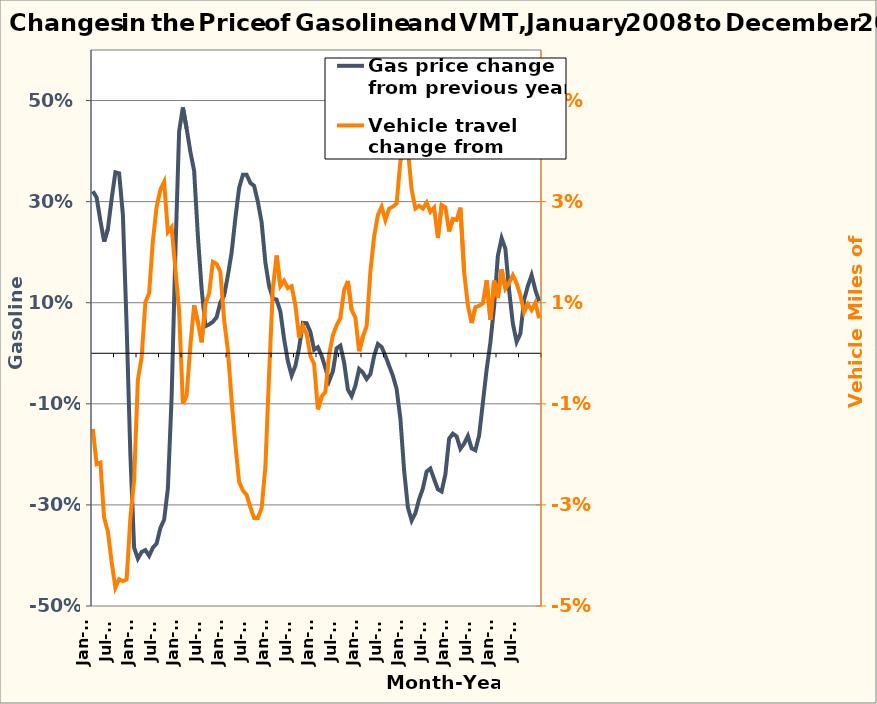
| Category | Gas price change from previous year |
|---|---|
| 2008-01-01 | 0.32 |
| 2008-02-01 | 0.308 |
| 2008-03-01 | 0.262 |
| 2008-04-01 | 0.221 |
| 2008-05-01 | 0.246 |
| 2008-06-01 | 0.305 |
| 2008-07-01 | 0.358 |
| 2008-08-01 | 0.356 |
| 2008-09-01 | 0.274 |
| 2008-10-01 | 0.054 |
| 2008-11-01 | -0.201 |
| 2008-12-01 | -0.384 |
| 2009-01-01 | -0.406 |
| 2009-02-01 | -0.393 |
| 2009-03-01 | -0.39 |
| 2009-04-01 | -0.401 |
| 2009-05-01 | -0.385 |
| 2009-06-01 | -0.376 |
| 2009-07-01 | -0.346 |
| 2009-08-01 | -0.329 |
| 2009-09-01 | -0.268 |
| 2009-10-01 | -0.087 |
| 2009-11-01 | 0.199 |
| 2009-12-01 | 0.439 |
| 2010-01-01 | 0.486 |
| 2010-02-01 | 0.445 |
| 2010-03-01 | 0.399 |
| 2010-04-01 | 0.361 |
| 2010-05-01 | 0.232 |
| 2010-06-01 | 0.127 |
| 2010-07-01 | 0.054 |
| 2010-08-01 | 0.057 |
| 2010-09-01 | 0.062 |
| 2010-10-01 | 0.071 |
| 2010-11-01 | 0.101 |
| 2010-12-01 | 0.114 |
| 2011-01-01 | 0.154 |
| 2011-02-01 | 0.199 |
| 2011-03-01 | 0.267 |
| 2011-04-01 | 0.327 |
| 2011-05-01 | 0.353 |
| 2011-06-01 | 0.353 |
| 2011-07-01 | 0.337 |
| 2011-08-01 | 0.331 |
| 2011-09-01 | 0.3 |
| 2011-10-01 | 0.259 |
| 2011-11-01 | 0.18 |
| 2011-12-01 | 0.133 |
| 2012-01-01 | 0.109 |
| 2012-02-01 | 0.106 |
| 2012-03-01 | 0.083 |
| 2012-04-01 | 0.028 |
| 2012-05-01 | -0.016 |
| 2012-06-01 | -0.044 |
| 2012-07-01 | -0.025 |
| 2012-08-01 | 0.011 |
| 2012-09-01 | 0.06 |
| 2012-10-01 | 0.059 |
| 2012-11-01 | 0.042 |
| 2012-12-01 | 0.007 |
| 2013-01-01 | 0.012 |
| 2013-02-01 | -0.005 |
| 2013-03-01 | -0.029 |
| 2013-04-01 | -0.055 |
| 2013-05-01 | -0.036 |
| 2013-06-01 | 0.01 |
| 2013-07-01 | 0.015 |
| 2013-08-01 | -0.018 |
| 2013-09-01 | -0.072 |
| 2013-10-01 | -0.085 |
| 2013-11-01 | -0.064 |
| 2013-12-01 | -0.031 |
| 2014-01-14 | -0.038 |
| 2014-02-14 | -0.051 |
| 2014-03-14 | -0.041 |
| 2014-04-14 | -0.005 |
| 2014-05-14 | 0.018 |
| 2014-06-14 | 0.012 |
| 2014-07-14 | -0.005 |
| 2014-08-14 | -0.025 |
| 2014-09-14 | -0.044 |
| 2014-10-14 | -0.071 |
| 2014-11-14 | -0.129 |
| 2014-12-14 | -0.232 |
| 2015-01-15 | -0.305 |
| 2015-02-15 | -0.331 |
| 2015-03-15 | -0.316 |
| 2015-04-15 | -0.289 |
| 2015-05-15 | -0.268 |
| 2015-06-15 | -0.234 |
| 2015-07-15 | -0.228 |
| 2015-08-15 | -0.249 |
| 2015-09-15 | -0.269 |
| 2015-10-15 | -0.273 |
| 2015-11-15 | -0.24 |
| 2015-12-15 | -0.169 |
| 2016-01-15 | -0.159 |
| 2016-02-15 | -0.165 |
| 2016-03-15 | -0.189 |
| 2016-04-15 | -0.179 |
| 2016-05-15 | -0.164 |
| 2016-06-15 | -0.188 |
| 2016-07-15 | -0.192 |
| 2016-08-15 | -0.163 |
| 2016-09-15 | -0.098 |
| 2016-10-15 | -0.032 |
| 2016-11-15 | 0.021 |
| 2016-12-15 | 0.093 |
| 2017-01-15 | 0.193 |
| 2017-02-15 | 0.228 |
| 2017-03-15 | 0.207 |
| 2017-04-15 | 0.124 |
| 2017-05-15 | 0.059 |
| 2017-06-15 | 0.023 |
| 2017-07-15 | 0.039 |
| 2017-08-15 | 0.106 |
| 2017-09-15 | 0.133 |
| 2017-10-15 | 0.155 |
| 2017-11-15 | 0.125 |
| 2017-12-15 | 0.103 |